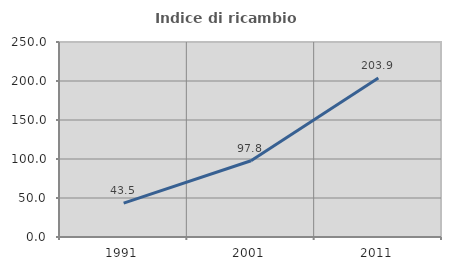
| Category | Indice di ricambio occupazionale  |
|---|---|
| 1991.0 | 43.5 |
| 2001.0 | 97.79 |
| 2011.0 | 203.906 |